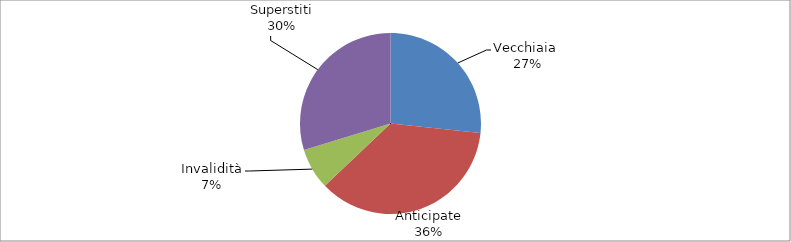
| Category | Series 0 |
|---|---|
| Vecchiaia  | 22164 |
| Anticipate | 30074 |
| Invalidità | 6130 |
| Superstiti | 24676 |